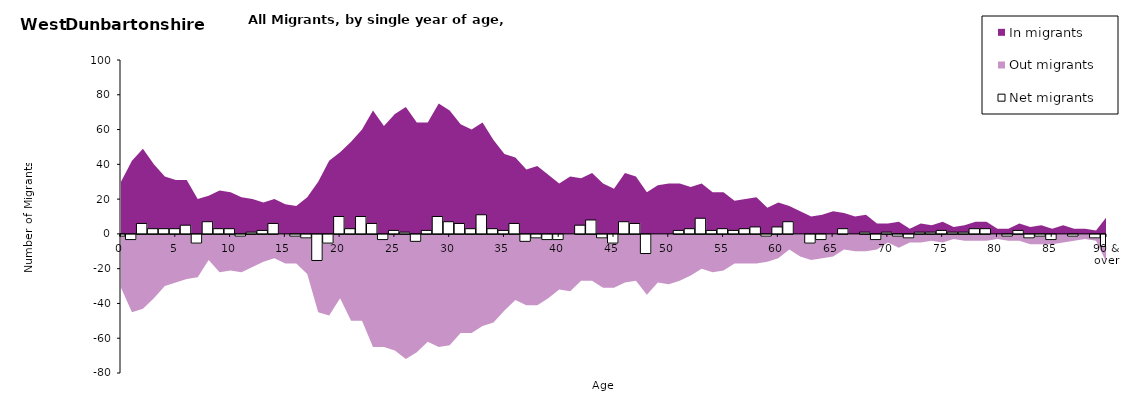
| Category |  Net migrants |
|---|---|
| 0 | -1 |
| 1 | -3 |
| 2 | 6 |
| 3 | 3 |
| 4 | 3 |
| 5 | 3 |
| 6 | 5 |
| 7 | -5 |
| 8 | 7 |
| 9 | 3 |
| 10 | 3 |
| 11 | -1 |
| 12 | 1 |
| 13 | 2 |
| 14 | 6 |
| 15 | 0 |
| 16 | -1 |
| 17 | -2 |
| 18 | -15 |
| 19 | -5 |
| 20 | 10 |
| 21 | 3 |
| 22 | 10 |
| 23 | 6 |
| 24 | -3 |
| 25 | 2 |
| 26 | 1 |
| 27 | -4 |
| 28 | 2 |
| 29 | 10 |
| 30 | 7 |
| 31 | 6 |
| 32 | 3 |
| 33 | 11 |
| 34 | 3 |
| 35 | 2 |
| 36 | 6 |
| 37 | -4 |
| 38 | -2 |
| 39 | -3 |
| 40 | -3 |
| 41 | 0 |
| 42 | 5 |
| 43 | 8 |
| 44 | -2 |
| 45 | -5 |
| 46 | 7 |
| 47 | 6 |
| 48 | -11 |
| 49 | 0 |
| 50 | 0 |
| 51 | 2 |
| 52 | 3 |
| 53 | 9 |
| 54 | 2 |
| 55 | 3 |
| 56 | 2 |
| 57 | 3 |
| 58 | 4 |
| 59 | -1 |
| 60 | 4 |
| 61 | 7 |
| 62 | 0 |
| 63 | -5 |
| 64 | -3 |
| 65 | 0 |
| 66 | 3 |
| 67 | 0 |
| 68 | 1 |
| 69 | -3 |
| 70 | 1 |
| 71 | -1 |
| 72 | -2 |
| 73 | 1 |
| 74 | 1 |
| 75 | 2 |
| 76 | 1 |
| 77 | 1 |
| 78 | 3 |
| 79 | 3 |
| 80 | 0 |
| 81 | -1 |
| 82 | 2 |
| 83 | -2 |
| 84 | -1 |
| 85 | -3 |
| 86 | 0 |
| 87 | -1 |
| 88 | 0 |
| 89 | -2 |
| 90 & over | -7 |